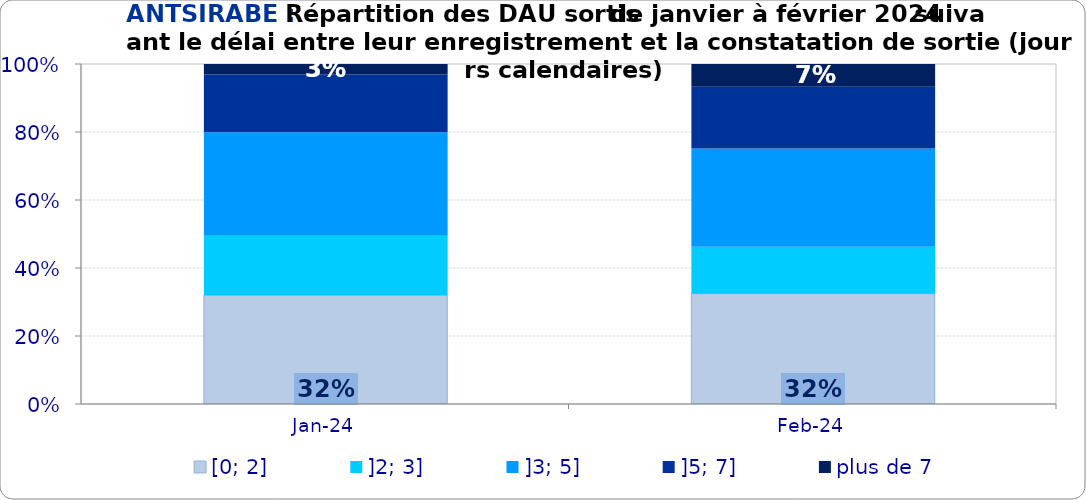
| Category | [0; 2] | ]2; 3] | ]3; 5] | ]5; 7] | plus de 7 |
|---|---|---|---|---|---|
| 2024-01-01 | 0.32 | 0.175 | 0.304 | 0.17 | 0.031 |
| 2024-02-01 | 0.324 | 0.138 | 0.289 | 0.182 | 0.067 |